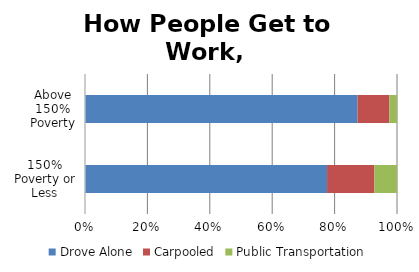
| Category | Drove Alone | Carpooled | Public Transportation |
|---|---|---|---|
| 150% Poverty or Less | 0.659 | 0.129 | 0.062 |
| Above 150% Poverty | 0.713 | 0.083 | 0.02 |